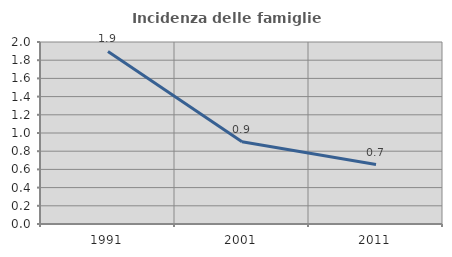
| Category | Incidenza delle famiglie numerose |
|---|---|
| 1991.0 | 1.896 |
| 2001.0 | 0.904 |
| 2011.0 | 0.653 |